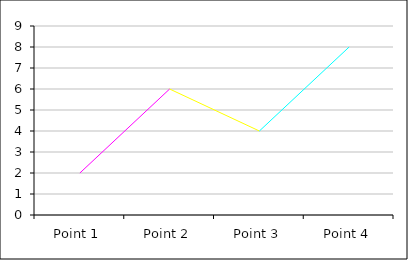
| Category | Series 1 |
|---|---|
| Point 1 | 2 |
| Point 2 | 6 |
| Point 3 | 4 |
| Point 4 | 8 |